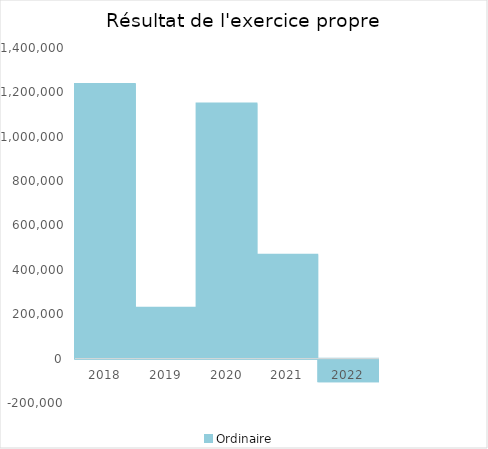
| Category |   | Ordinaire |    |
|---|---|---|---|
| 2018.0 |  | 1237772.52 |  |
| 2019.0 |  | 229572.49 |  |
| 2020.0 |  | 1149447.86 |  |
| 2021.0 |  | 468341.01 |  |
| 2022.0 |  | -102142.44 |  |